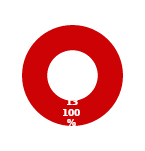
| Category | RESPONSE |
|---|---|
| MIL 3 Complete | 0 |
| MIL 3 Not Complete | 13 |